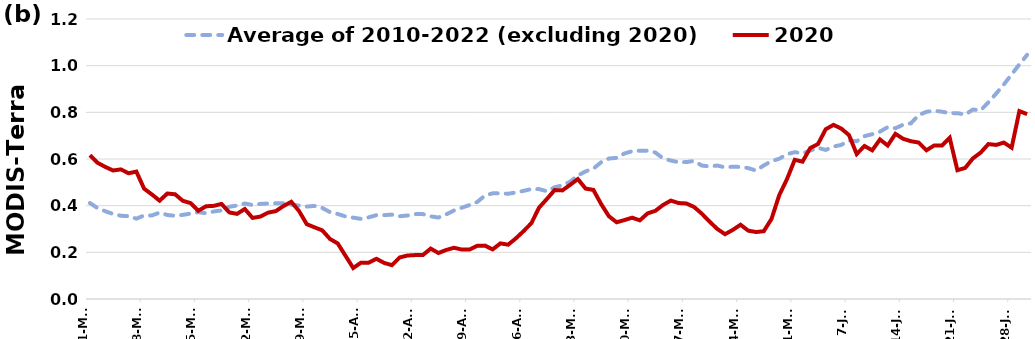
| Category | Average of 2010-2022 (excluding 2020) | 2020 |
|---|---|---|
| 2000-03-01 | 0.411 | 0.616 |
| 2000-03-02 | 0.389 | 0.584 |
| 2000-03-03 | 0.376 | 0.566 |
| 2000-03-04 | 0.364 | 0.551 |
| 2000-03-05 | 0.357 | 0.556 |
| 2000-03-06 | 0.355 | 0.539 |
| 2000-03-07 | 0.344 | 0.546 |
| 2000-03-08 | 0.358 | 0.473 |
| 2000-03-09 | 0.358 | 0.448 |
| 2000-03-10 | 0.37 | 0.421 |
| 2000-03-11 | 0.36 | 0.452 |
| 2000-03-12 | 0.357 | 0.449 |
| 2000-03-13 | 0.361 | 0.421 |
| 2000-03-14 | 0.366 | 0.411 |
| 2000-03-15 | 0.372 | 0.378 |
| 2000-03-16 | 0.367 | 0.397 |
| 2000-03-17 | 0.375 | 0.399 |
| 2000-03-18 | 0.38 | 0.407 |
| 2000-03-19 | 0.395 | 0.371 |
| 2000-03-20 | 0.401 | 0.365 |
| 2000-03-21 | 0.409 | 0.386 |
| 2000-03-22 | 0.403 | 0.348 |
| 2000-03-23 | 0.408 | 0.353 |
| 2000-03-24 | 0.409 | 0.37 |
| 2000-03-25 | 0.41 | 0.377 |
| 2000-03-26 | 0.411 | 0.398 |
| 2000-03-27 | 0.404 | 0.417 |
| 2000-03-28 | 0.4 | 0.377 |
| 2000-03-29 | 0.396 | 0.321 |
| 2000-03-30 | 0.399 | 0.307 |
| 2000-03-31 | 0.39 | 0.294 |
| 2000-04-01 | 0.372 | 0.257 |
| 2000-04-02 | 0.364 | 0.238 |
| 2000-04-03 | 0.354 | 0.185 |
| 2000-04-04 | 0.349 | 0.133 |
| 2000-04-05 | 0.343 | 0.156 |
| 2000-04-06 | 0.35 | 0.156 |
| 2000-04-07 | 0.359 | 0.172 |
| 2000-04-08 | 0.359 | 0.155 |
| 2000-04-09 | 0.362 | 0.145 |
| 2000-04-10 | 0.355 | 0.178 |
| 2000-04-11 | 0.358 | 0.186 |
| 2000-04-12 | 0.364 | 0.188 |
| 2000-04-13 | 0.364 | 0.189 |
| 2000-04-14 | 0.354 | 0.216 |
| 2000-04-15 | 0.349 | 0.197 |
| 2000-04-16 | 0.363 | 0.21 |
| 2000-04-17 | 0.379 | 0.22 |
| 2000-04-18 | 0.391 | 0.212 |
| 2000-04-19 | 0.402 | 0.212 |
| 2000-04-20 | 0.416 | 0.228 |
| 2000-04-21 | 0.443 | 0.229 |
| 2000-04-22 | 0.453 | 0.213 |
| 2000-04-23 | 0.453 | 0.238 |
| 2000-04-24 | 0.451 | 0.233 |
| 2000-04-25 | 0.456 | 0.26 |
| 2000-04-26 | 0.464 | 0.291 |
| 2000-04-27 | 0.471 | 0.325 |
| 2000-04-28 | 0.471 | 0.392 |
| 2000-04-29 | 0.462 | 0.429 |
| 2000-04-30 | 0.479 | 0.467 |
| 2000-05-01 | 0.487 | 0.465 |
| 2000-05-02 | 0.503 | 0.489 |
| 2000-05-03 | 0.529 | 0.514 |
| 2000-05-04 | 0.547 | 0.473 |
| 2000-05-05 | 0.559 | 0.468 |
| 2000-05-06 | 0.586 | 0.407 |
| 2000-05-07 | 0.602 | 0.355 |
| 2000-05-08 | 0.605 | 0.329 |
| 2000-05-09 | 0.623 | 0.338 |
| 2000-05-10 | 0.633 | 0.348 |
| 2000-05-11 | 0.636 | 0.337 |
| 2000-05-12 | 0.636 | 0.367 |
| 2000-05-13 | 0.628 | 0.378 |
| 2000-05-14 | 0.603 | 0.403 |
| 2000-05-15 | 0.593 | 0.422 |
| 2000-05-16 | 0.586 | 0.411 |
| 2000-05-17 | 0.587 | 0.409 |
| 2000-05-18 | 0.592 | 0.394 |
| 2000-05-19 | 0.572 | 0.366 |
| 2000-05-20 | 0.568 | 0.332 |
| 2000-05-21 | 0.572 | 0.3 |
| 2000-05-22 | 0.564 | 0.278 |
| 2000-05-23 | 0.567 | 0.296 |
| 2000-05-24 | 0.566 | 0.318 |
| 2000-05-25 | 0.561 | 0.293 |
| 2000-05-26 | 0.551 | 0.287 |
| 2000-05-27 | 0.573 | 0.29 |
| 2000-05-28 | 0.591 | 0.343 |
| 2000-05-29 | 0.601 | 0.445 |
| 2000-05-30 | 0.62 | 0.514 |
| 2000-05-31 | 0.629 | 0.597 |
| 2000-06-01 | 0.624 | 0.589 |
| 2000-06-02 | 0.636 | 0.647 |
| 2000-06-03 | 0.648 | 0.664 |
| 2000-06-04 | 0.639 | 0.728 |
| 2000-06-05 | 0.653 | 0.746 |
| 2000-06-06 | 0.66 | 0.731 |
| 2000-06-07 | 0.679 | 0.703 |
| 2000-06-08 | 0.676 | 0.621 |
| 2000-06-09 | 0.698 | 0.656 |
| 2000-06-10 | 0.706 | 0.637 |
| 2000-06-11 | 0.717 | 0.684 |
| 2000-06-12 | 0.736 | 0.658 |
| 2000-06-13 | 0.732 | 0.708 |
| 2000-06-14 | 0.747 | 0.687 |
| 2000-06-15 | 0.753 | 0.676 |
| 2000-06-16 | 0.788 | 0.67 |
| 2000-06-17 | 0.802 | 0.637 |
| 2000-06-18 | 0.807 | 0.658 |
| 2000-06-19 | 0.803 | 0.657 |
| 2000-06-20 | 0.797 | 0.691 |
| 2000-06-21 | 0.796 | 0.552 |
| 2000-06-22 | 0.79 | 0.562 |
| 2000-06-23 | 0.812 | 0.603 |
| 2000-06-24 | 0.809 | 0.627 |
| 2000-06-25 | 0.843 | 0.664 |
| 2000-06-26 | 0.88 | 0.66 |
| 2000-06-27 | 0.92 | 0.67 |
| 2000-06-28 | 0.962 | 0.648 |
| 2000-06-29 | 1.005 | 0.805 |
| 2000-06-30 | 1.046 | 0.792 |